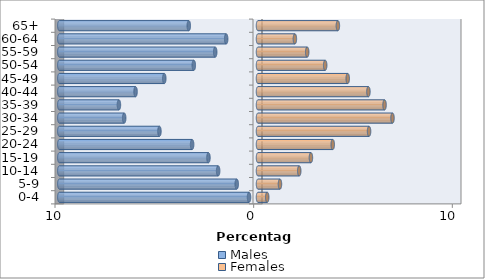
| Category | Males | Females |
|---|---|---|
| 0-4 | -0.452 | 0.464 |
| 5-9 | -1.071 | 1.106 |
| 10-14 | -2.007 | 2.075 |
| 15-19 | -2.494 | 2.664 |
| 20-24 | -3.316 | 3.762 |
| 25-29 | -4.961 | 5.59 |
| 30-34 | -6.736 | 6.77 |
| 35-39 | -7.001 | 6.37 |
| 40-44 | -6.163 | 5.558 |
| 45-49 | -4.718 | 4.516 |
| 50-54 | -3.231 | 3.382 |
| 55-59 | -2.154 | 2.476 |
| 60-64 | -1.602 | 1.857 |
| 65+ | -3.484 | 4.021 |